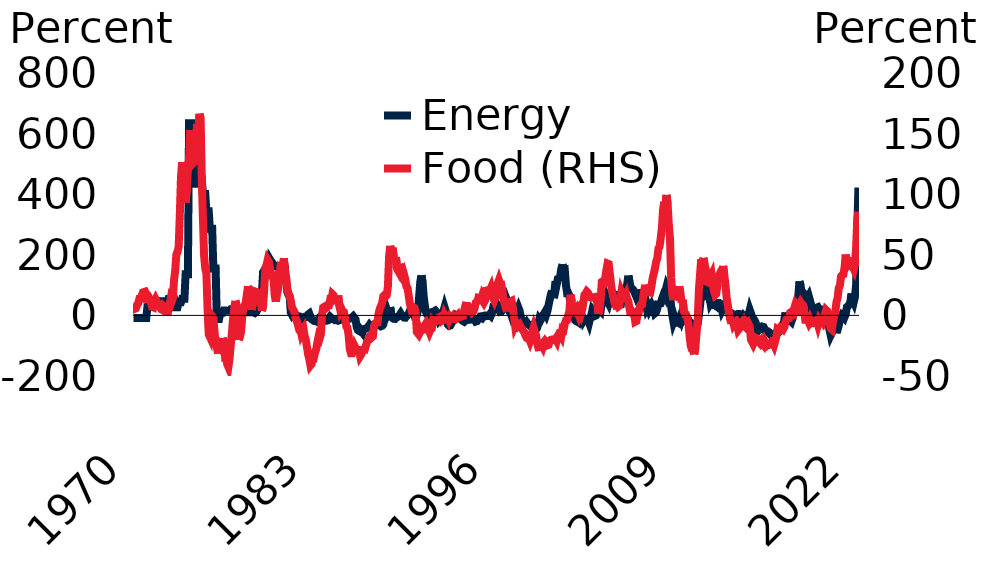
| Category | Energy |
|---|---|
| 1970-01-01 | -8.3 |
| 1970-02-01 | -8.3 |
| 1970-03-01 | -8.3 |
| 1970-04-01 | -8.3 |
| 1970-05-01 | -8.3 |
| 1970-06-01 | -8.3 |
| 1970-07-01 | -8.3 |
| 1970-08-01 | -8.3 |
| 1970-09-01 | -8.3 |
| 1970-10-01 | -8.3 |
| 1970-11-01 | -8.3 |
| 1970-12-01 | -8.3 |
| 1971-01-01 | 29.1 |
| 1971-02-01 | 29.1 |
| 1971-03-01 | 29.1 |
| 1971-04-01 | 29.1 |
| 1971-05-01 | 29.1 |
| 1971-06-01 | 29.1 |
| 1971-07-01 | 37 |
| 1971-08-01 | 37 |
| 1971-09-01 | 37 |
| 1971-10-01 | 37 |
| 1971-11-01 | 37 |
| 1971-12-01 | 37 |
| 1972-01-01 | 46.3 |
| 1972-02-01 | 46.3 |
| 1972-03-01 | 46.3 |
| 1972-04-01 | 46.3 |
| 1972-05-01 | 46.3 |
| 1972-06-01 | 46.3 |
| 1972-07-01 | 54.5 |
| 1972-08-01 | 54.5 |
| 1972-09-01 | 54.5 |
| 1972-10-01 | 54.5 |
| 1972-11-01 | 54.5 |
| 1972-12-01 | 54.5 |
| 1973-01-01 | 26.8 |
| 1973-02-01 | 26.8 |
| 1973-03-01 | 26.8 |
| 1973-04-01 | 43.3 |
| 1973-05-01 | 43.3 |
| 1973-06-01 | 43.3 |
| 1973-07-01 | 55.2 |
| 1973-08-01 | 55.2 |
| 1973-09-01 | 55.2 |
| 1973-10-01 | 135.6 |
| 1973-11-01 | 135.6 |
| 1973-12-01 | 135.6 |
| 1974-01-01 | 634.5 |
| 1974-02-01 | 634.5 |
| 1974-03-01 | 634.5 |
| 1974-04-01 | 498.9 |
| 1974-05-01 | 498.9 |
| 1974-06-01 | 498.9 |
| 1974-07-01 | 434.8 |
| 1974-08-01 | 434.8 |
| 1974-09-01 | 434.8 |
| 1974-10-01 | 450.8 |
| 1974-11-01 | 450.8 |
| 1974-12-01 | 450.8 |
| 1975-01-01 | 401 |
| 1975-02-01 | 401 |
| 1975-03-01 | 401 |
| 1975-04-01 | 343.4 |
| 1975-05-01 | 343.4 |
| 1975-06-01 | 343.4 |
| 1975-07-01 | 286.3 |
| 1975-08-01 | 286.3 |
| 1975-09-01 | 286.3 |
| 1975-10-01 | 155.1 |
| 1975-11-01 | 155.1 |
| 1975-12-01 | 155.1 |
| 1976-01-01 | -11.5 |
| 1976-02-01 | -11.5 |
| 1976-03-01 | -11.5 |
| 1976-04-01 | 8.6 |
| 1976-05-01 | 8.6 |
| 1976-06-01 | 8.6 |
| 1976-07-01 | 16 |
| 1976-08-01 | 16 |
| 1976-09-01 | 16 |
| 1976-10-01 | 15.5 |
| 1976-11-01 | 15.5 |
| 1976-12-01 | 15.5 |
| 1977-01-01 | 20 |
| 1977-02-01 | 20 |
| 1977-03-01 | 20 |
| 1977-04-01 | 19.5 |
| 1977-05-01 | 19.5 |
| 1977-06-01 | 19.5 |
| 1977-07-01 | 21.1 |
| 1977-08-01 | 21.1 |
| 1977-09-01 | 21.1 |
| 1977-10-01 | 21.2 |
| 1977-11-01 | 21.2 |
| 1977-12-01 | 21.2 |
| 1978-01-01 | 10 |
| 1978-02-01 | 10 |
| 1978-03-01 | 10 |
| 1978-04-01 | 10.2 |
| 1978-05-01 | 10.3 |
| 1978-06-01 | 10.6 |
| 1978-07-01 | 10.1 |
| 1978-08-01 | 10.3 |
| 1978-09-01 | 10.3 |
| 1978-10-01 | 8 |
| 1978-11-01 | 10.9 |
| 1978-12-01 | 17.2 |
| 1979-01-01 | 39.7 |
| 1979-02-01 | 60.6 |
| 1979-03-01 | 68.6 |
| 1979-04-01 | 71.5 |
| 1979-05-01 | 142.3 |
| 1979-06-01 | 149 |
| 1979-07-01 | 138.9 |
| 1979-08-01 | 142.8 |
| 1979-09-01 | 152 |
| 1979-10-01 | 162.6 |
| 1979-11-01 | 184.7 |
| 1979-12-01 | 178.4 |
| 1980-01-01 | 173.7 |
| 1980-02-01 | 163.7 |
| 1980-03-01 | 162.3 |
| 1980-04-01 | 161.9 |
| 1980-05-01 | 163.3 |
| 1980-06-01 | 161.7 |
| 1980-07-01 | 152.1 |
| 1980-08-01 | 137.7 |
| 1980-09-01 | 137.1 |
| 1980-10-01 | 163.8 |
| 1980-11-01 | 176 |
| 1980-12-01 | 152.7 |
| 1981-01-01 | 113.1 |
| 1981-02-01 | 77.6 |
| 1981-03-01 | 67.7 |
| 1981-04-01 | 62.8 |
| 1981-05-01 | 9.8 |
| 1981-06-01 | 2.4 |
| 1981-07-01 | 7.8 |
| 1981-08-01 | 7.4 |
| 1981-09-01 | 3.5 |
| 1981-10-01 | 0.6 |
| 1981-11-01 | -4.7 |
| 1981-12-01 | -3.2 |
| 1982-01-01 | -3.9 |
| 1982-02-01 | -6.4 |
| 1982-03-01 | -10.8 |
| 1982-04-01 | -7.2 |
| 1982-05-01 | -4.9 |
| 1982-06-01 | -5.5 |
| 1982-07-01 | -1.6 |
| 1982-08-01 | 3 |
| 1982-09-01 | 5.9 |
| 1982-10-01 | -4.2 |
| 1982-11-01 | -12.4 |
| 1982-12-01 | -15.2 |
| 1983-01-01 | -18.1 |
| 1983-02-01 | -18.2 |
| 1983-03-01 | -19.8 |
| 1983-04-01 | -15.6 |
| 1983-05-01 | -12.2 |
| 1983-06-01 | -7.1 |
| 1983-07-01 | -8.9 |
| 1983-08-01 | -9.4 |
| 1983-09-01 | -10.7 |
| 1983-10-01 | -13.4 |
| 1983-11-01 | -16.9 |
| 1983-12-01 | -17.5 |
| 1984-01-01 | -16.4 |
| 1984-02-01 | -10.3 |
| 1984-03-01 | -4.7 |
| 1984-04-01 | -8.2 |
| 1984-05-01 | -11.8 |
| 1984-06-01 | -11.9 |
| 1984-07-01 | -14.9 |
| 1984-08-01 | -13.5 |
| 1984-09-01 | -15.6 |
| 1984-10-01 | -17.5 |
| 1984-11-01 | -16.1 |
| 1984-12-01 | -14.3 |
| 1985-01-01 | -12.2 |
| 1985-02-01 | -5.7 |
| 1985-03-01 | -2.9 |
| 1985-04-01 | -6.4 |
| 1985-05-01 | -9.1 |
| 1985-06-01 | -11.3 |
| 1985-07-01 | -11.6 |
| 1985-08-01 | -10.7 |
| 1985-09-01 | -9.8 |
| 1985-10-01 | -6.3 |
| 1985-11-01 | -2.8 |
| 1985-12-01 | -7.7 |
| 1986-01-01 | -13.3 |
| 1986-02-01 | -38.3 |
| 1986-03-01 | -48.5 |
| 1986-04-01 | -50.8 |
| 1986-05-01 | -46.1 |
| 1986-06-01 | -51.3 |
| 1986-07-01 | -56.4 |
| 1986-08-01 | -45 |
| 1986-09-01 | -44.1 |
| 1986-10-01 | -43.8 |
| 1986-11-01 | -41.9 |
| 1986-12-01 | -37.1 |
| 1987-01-01 | -31.4 |
| 1987-02-01 | -35.9 |
| 1987-03-01 | -34.7 |
| 1987-04-01 | -34.9 |
| 1987-05-01 | -31.1 |
| 1987-06-01 | -29.7 |
| 1987-07-01 | -26.4 |
| 1987-08-01 | -30.2 |
| 1987-09-01 | -31.9 |
| 1987-10-01 | -32.5 |
| 1987-11-01 | -35.9 |
| 1987-12-01 | -34.5 |
| 1988-01-01 | -30.3 |
| 1988-02-01 | -6.2 |
| 1988-03-01 | 5.4 |
| 1988-04-01 | 18.9 |
| 1988-05-01 | 7.1 |
| 1988-06-01 | 15.2 |
| 1988-07-01 | 27.2 |
| 1988-08-01 | 1.2 |
| 1988-09-01 | -8.6 |
| 1988-10-01 | -11.4 |
| 1988-11-01 | -11.5 |
| 1988-12-01 | -5.5 |
| 1989-01-01 | -6.1 |
| 1989-02-01 | -3.5 |
| 1989-03-01 | 0.6 |
| 1989-04-01 | 6.4 |
| 1989-05-01 | -0.1 |
| 1989-06-01 | -2.9 |
| 1989-07-01 | -7.1 |
| 1989-08-01 | -7.5 |
| 1989-09-01 | -1.8 |
| 1989-10-01 | 0.5 |
| 1989-11-01 | 4.8 |
| 1989-12-01 | 16 |
| 1990-01-01 | 23 |
| 1990-02-01 | 21 |
| 1990-03-01 | 18.9 |
| 1990-04-01 | 2 |
| 1990-05-01 | 4.2 |
| 1990-06-01 | 1.5 |
| 1990-07-01 | 15.2 |
| 1990-08-01 | 61.5 |
| 1990-09-01 | 110.7 |
| 1990-10-01 | 131.9 |
| 1990-11-01 | 109.3 |
| 1990-12-01 | 60.5 |
| 1991-01-01 | 31.4 |
| 1991-02-01 | 10.1 |
| 1991-03-01 | 2.5 |
| 1991-04-01 | -0.8 |
| 1991-05-01 | 4.8 |
| 1991-06-01 | 1.7 |
| 1991-07-01 | 6.1 |
| 1991-08-01 | 12.4 |
| 1991-09-01 | 13.6 |
| 1991-10-01 | 15.8 |
| 1991-11-01 | 11.4 |
| 1991-12-01 | -6.3 |
| 1992-01-01 | -16.5 |
| 1992-02-01 | -11.6 |
| 1992-03-01 | -4.9 |
| 1992-04-01 | 9 |
| 1992-05-01 | 13.1 |
| 1992-06-01 | 26.8 |
| 1992-07-01 | 14.5 |
| 1992-08-01 | -19.7 |
| 1992-09-01 | -30.7 |
| 1992-10-01 | -34.4 |
| 1992-11-01 | -33.4 |
| 1992-12-01 | -26.4 |
| 1993-01-01 | -20.1 |
| 1993-02-01 | -1.4 |
| 1993-03-01 | 3.2 |
| 1993-04-01 | 1.8 |
| 1993-05-01 | -1.4 |
| 1993-06-01 | -1 |
| 1993-07-01 | -9.3 |
| 1993-08-01 | -9.4 |
| 1993-09-01 | -15.5 |
| 1993-10-01 | -18.9 |
| 1993-11-01 | -20.8 |
| 1993-12-01 | -16.8 |
| 1994-01-01 | -10.9 |
| 1994-02-01 | -11.1 |
| 1994-03-01 | -14.7 |
| 1994-04-01 | -14.3 |
| 1994-05-01 | -13.2 |
| 1994-06-01 | -13.9 |
| 1994-07-01 | -9.4 |
| 1994-08-01 | -13.3 |
| 1994-09-01 | -20.3 |
| 1994-10-01 | -19 |
| 1994-11-01 | -11.1 |
| 1994-12-01 | -10.8 |
| 1995-01-01 | -3.3 |
| 1995-02-01 | -2.8 |
| 1995-03-01 | -6.8 |
| 1995-04-01 | -1.7 |
| 1995-05-01 | -0.2 |
| 1995-06-01 | -0.3 |
| 1995-07-01 | -2.2 |
| 1995-08-01 | -1.7 |
| 1995-09-01 | 3.1 |
| 1995-10-01 | -0.9 |
| 1995-11-01 | 8.3 |
| 1995-12-01 | 25.6 |
| 1996-01-01 | 24.9 |
| 1996-02-01 | 33.1 |
| 1996-03-01 | 38.4 |
| 1996-04-01 | 32.8 |
| 1996-05-01 | 17.4 |
| 1996-06-01 | 11.3 |
| 1996-07-01 | 12 |
| 1996-08-01 | 19.7 |
| 1996-09-01 | 32.9 |
| 1996-10-01 | 40.6 |
| 1996-11-01 | 33.9 |
| 1996-12-01 | 49.6 |
| 1997-01-01 | 39.3 |
| 1997-02-01 | 17 |
| 1997-03-01 | 10.6 |
| 1997-04-01 | -1.1 |
| 1997-05-01 | 6.7 |
| 1997-06-01 | 4.6 |
| 1997-07-01 | 13.5 |
| 1997-08-01 | 14.4 |
| 1997-09-01 | 14.1 |
| 1997-10-01 | 24.3 |
| 1997-11-01 | 14.4 |
| 1997-12-01 | -6.6 |
| 1998-01-01 | -17.1 |
| 1998-02-01 | -25 |
| 1998-03-01 | -28.6 |
| 1998-04-01 | -28.2 |
| 1998-05-01 | -22.7 |
| 1998-06-01 | -28.1 |
| 1998-07-01 | -30.4 |
| 1998-08-01 | -34.2 |
| 1998-09-01 | -32.5 |
| 1998-10-01 | -39.7 |
| 1998-11-01 | -42.7 |
| 1998-12-01 | -52.8 |
| 1999-01-01 | -47.5 |
| 1999-02-01 | -42.2 |
| 1999-03-01 | -28.9 |
| 1999-04-01 | -11.9 |
| 1999-05-01 | -16.6 |
| 1999-06-01 | -9.5 |
| 1999-07-01 | 0.1 |
| 1999-08-01 | 4.7 |
| 1999-09-01 | 11.5 |
| 1999-10-01 | 3.5 |
| 1999-11-01 | 14.8 |
| 1999-12-01 | 34.1 |
| 2000-01-01 | 52.8 |
| 2000-02-01 | 69.4 |
| 2000-03-01 | 81.4 |
| 2000-04-01 | 57.6 |
| 2000-05-01 | 79 |
| 2000-06-01 | 113 |
| 2000-07-01 | 101.9 |
| 2000-08-01 | 120.8 |
| 2000-09-01 | 122.5 |
| 2000-10-01 | 128.6 |
| 2000-11-01 | 154.3 |
| 2000-12-01 | 168.4 |
| 2001-01-01 | 149.1 |
| 2001-02-01 | 150.1 |
| 2001-03-01 | 100.2 |
| 2001-04-01 | 73.6 |
| 2001-05-01 | 73.7 |
| 2001-06-01 | 64.8 |
| 2001-07-01 | 33.5 |
| 2001-08-01 | 26.9 |
| 2001-09-01 | 11.2 |
| 2001-10-01 | -2.4 |
| 2001-11-01 | -16.2 |
| 2001-12-01 | -19.7 |
| 2002-01-01 | -20.5 |
| 2002-02-01 | -23.1 |
| 2002-03-01 | -11 |
| 2002-04-01 | 6.8 |
| 2002-05-01 | -5.6 |
| 2002-06-01 | -18 |
| 2002-07-01 | -11.6 |
| 2002-08-01 | -12.5 |
| 2002-09-01 | -15.1 |
| 2002-10-01 | -13.7 |
| 2002-11-01 | -24.1 |
| 2002-12-01 | -8.2 |
| 2003-01-01 | 1.5 |
| 2003-02-01 | 19.8 |
| 2003-03-01 | 15.7 |
| 2003-04-01 | -1.9 |
| 2003-05-01 | -0.3 |
| 2003-06-01 | 8.2 |
| 2003-07-01 | 18.1 |
| 2003-08-01 | 18.3 |
| 2003-09-01 | 14.4 |
| 2003-10-01 | 40.2 |
| 2003-11-01 | 53.7 |
| 2003-12-01 | 67.5 |
| 2004-01-01 | 71.6 |
| 2004-02-01 | 62.7 |
| 2004-03-01 | 47.4 |
| 2004-04-01 | 39.6 |
| 2004-05-01 | 52.7 |
| 2004-06-01 | 54.2 |
| 2004-07-01 | 56.3 |
| 2004-08-01 | 61.5 |
| 2004-09-01 | 49 |
| 2004-10-01 | 68.6 |
| 2004-11-01 | 68.3 |
| 2004-12-01 | 42.2 |
| 2005-01-01 | 37.8 |
| 2005-02-01 | 26.2 |
| 2005-03-01 | 58.6 |
| 2005-04-01 | 83.6 |
| 2005-05-01 | 67.8 |
| 2005-06-01 | 77.9 |
| 2005-07-01 | 87.7 |
| 2005-08-01 | 103.1 |
| 2005-09-01 | 131.1 |
| 2005-10-01 | 111.5 |
| 2005-11-01 | 92.6 |
| 2005-12-01 | 89 |
| 2006-01-01 | 85.7 |
| 2006-02-01 | 79.4 |
| 2006-03-01 | 70.1 |
| 2006-04-01 | 84.3 |
| 2006-05-01 | 66 |
| 2006-06-01 | 71.8 |
| 2006-07-01 | 73.2 |
| 2006-08-01 | 62.5 |
| 2006-09-01 | 41.8 |
| 2006-10-01 | 20.1 |
| 2006-11-01 | 35.6 |
| 2006-12-01 | 45.7 |
| 2007-01-01 | 22.6 |
| 2007-02-01 | 29 |
| 2007-03-01 | 17.8 |
| 2007-04-01 | 25.1 |
| 2007-05-01 | 32.7 |
| 2007-06-01 | 23.5 |
| 2007-07-01 | 24 |
| 2007-08-01 | 7.4 |
| 2007-09-01 | 10.7 |
| 2007-10-01 | 22.4 |
| 2007-11-01 | 48.2 |
| 2007-12-01 | 38.1 |
| 2008-01-01 | 39.3 |
| 2008-02-01 | 53.6 |
| 2008-03-01 | 64.2 |
| 2008-04-01 | 59.7 |
| 2008-05-01 | 79.4 |
| 2008-06-01 | 94.8 |
| 2008-07-01 | 86.3 |
| 2008-08-01 | 59.9 |
| 2008-09-01 | 65.3 |
| 2008-10-01 | 31.1 |
| 2008-11-01 | 1 |
| 2008-12-01 | -20.7 |
| 2009-01-01 | -10.4 |
| 2009-02-01 | -23.6 |
| 2009-03-01 | -21.3 |
| 2009-04-01 | -23.6 |
| 2009-05-01 | -13.8 |
| 2009-06-01 | -3.5 |
| 2009-07-01 | -14.4 |
| 2009-08-01 | -3.2 |
| 2009-09-01 | -14.1 |
| 2009-10-01 | -12.3 |
| 2009-11-01 | -17.5 |
| 2009-12-01 | -16.6 |
| 2010-01-01 | -15.3 |
| 2010-02-01 | -21.8 |
| 2010-03-01 | -24.8 |
| 2010-04-01 | -26.5 |
| 2010-05-01 | -40 |
| 2010-06-01 | -44.5 |
| 2010-07-01 | -45 |
| 2010-08-01 | -35.6 |
| 2010-09-01 | -27.5 |
| 2010-10-01 | 0.6 |
| 2010-11-01 | 31.9 |
| 2010-12-01 | 74.8 |
| 2011-01-01 | 78.5 |
| 2011-02-01 | 100.8 |
| 2011-03-01 | 107.2 |
| 2011-04-01 | 114 |
| 2011-05-01 | 77.7 |
| 2011-06-01 | 50.9 |
| 2011-07-01 | 65 |
| 2011-08-01 | 41.8 |
| 2011-09-01 | 48.6 |
| 2011-10-01 | 34.3 |
| 2011-11-01 | 34.5 |
| 2011-12-01 | 33.5 |
| 2012-01-01 | 30.7 |
| 2012-02-01 | 40.9 |
| 2012-03-01 | 40.9 |
| 2012-04-01 | 30 |
| 2012-05-01 | 32.1 |
| 2012-06-01 | 16.7 |
| 2012-07-01 | 24.4 |
| 2012-08-01 | 32.8 |
| 2012-09-01 | 33.8 |
| 2012-10-01 | 23.9 |
| 2012-11-01 | 17.5 |
| 2012-12-01 | 10.2 |
| 2013-01-01 | 9.7 |
| 2013-02-01 | 7.7 |
| 2013-03-01 | -5.2 |
| 2013-04-01 | -13.3 |
| 2013-05-01 | -7.5 |
| 2013-06-01 | -6.3 |
| 2013-07-01 | -4.2 |
| 2013-08-01 | 4.6 |
| 2013-09-01 | 4.9 |
| 2013-10-01 | 3.3 |
| 2013-11-01 | -3.1 |
| 2013-12-01 | 1.1 |
| 2014-01-01 | -3.3 |
| 2014-02-01 | -4.2 |
| 2014-03-01 | -9.4 |
| 2014-04-01 | -5.7 |
| 2014-05-01 | 2.1 |
| 2014-06-01 | 17.9 |
| 2014-07-01 | 7.1 |
| 2014-08-01 | -5.1 |
| 2014-09-01 | -9.3 |
| 2014-10-01 | -15.6 |
| 2014-11-01 | -22.3 |
| 2014-12-01 | -36.7 |
| 2015-01-01 | -50.9 |
| 2015-02-01 | -46 |
| 2015-03-01 | -45.8 |
| 2015-04-01 | -41.6 |
| 2015-05-01 | -37 |
| 2015-06-01 | -38.1 |
| 2015-07-01 | -46.3 |
| 2015-08-01 | -54.7 |
| 2015-09-01 | -54.7 |
| 2015-10-01 | -53.5 |
| 2015-11-01 | -56.3 |
| 2015-12-01 | -63.4 |
| 2016-01-01 | -68.3 |
| 2016-02-01 | -68.8 |
| 2016-03-01 | -63.1 |
| 2016-04-01 | -60.3 |
| 2016-05-01 | -56 |
| 2016-06-01 | -54.5 |
| 2016-07-01 | -55.4 |
| 2016-08-01 | -52.6 |
| 2016-09-01 | -50.1 |
| 2016-10-01 | -39.4 |
| 2016-11-01 | -37.7 |
| 2016-12-01 | -12.8 |
| 2017-01-01 | 9.8 |
| 2017-02-01 | -2.2 |
| 2017-03-01 | -4.7 |
| 2017-04-01 | -6.8 |
| 2017-05-01 | -17.2 |
| 2017-06-01 | -20.9 |
| 2017-07-01 | -9.6 |
| 2017-08-01 | 10.2 |
| 2017-09-01 | 15.3 |
| 2017-10-01 | 18.8 |
| 2017-11-01 | 39.8 |
| 2017-12-01 | 64.9 |
| 2018-01-01 | 112.5 |
| 2018-02-01 | 97.5 |
| 2018-03-01 | 71.4 |
| 2018-04-01 | 68.5 |
| 2018-05-01 | 61.7 |
| 2018-06-01 | 52 |
| 2018-07-01 | 62 |
| 2018-08-01 | 57.4 |
| 2018-09-01 | 64.2 |
| 2018-10-01 | 50.6 |
| 2018-11-01 | 36.4 |
| 2018-12-01 | 6.1 |
| 2019-01-01 | 6.5 |
| 2019-02-01 | 11.6 |
| 2019-03-01 | 22.6 |
| 2019-04-01 | 25.7 |
| 2019-05-01 | 27.3 |
| 2019-06-01 | 21.3 |
| 2019-07-01 | 20.4 |
| 2019-08-01 | 7.8 |
| 2019-09-01 | 7 |
| 2019-10-01 | 0.1 |
| 2019-11-01 | -2.6 |
| 2019-12-01 | -1.5 |
| 2020-01-01 | -12.4 |
| 2020-02-01 | -19.3 |
| 2020-03-01 | -48 |
| 2020-04-01 | -65.8 |
| 2020-05-01 | -57.7 |
| 2020-06-01 | -46.8 |
| 2020-07-01 | -44.2 |
| 2020-08-01 | -40.5 |
| 2020-09-01 | -46.7 |
| 2020-10-01 | -47 |
| 2020-11-01 | -33.3 |
| 2020-12-01 | -13.4 |
| 2021-01-01 | -6.1 |
| 2021-02-01 | 2.4 |
| 2021-03-01 | -0.1 |
| 2021-04-01 | -5.7 |
| 2021-05-01 | 4 |
| 2021-06-01 | 27.5 |
| 2021-07-01 | 30.5 |
| 2021-08-01 | 35.9 |
| 2021-09-01 | 43.8 |
| 2021-10-01 | 72.5 |
| 2021-11-01 | 53.8 |
| 2021-12-01 | 44.8 |
| 2022-01-01 | 61.5 |
| 2022-02-01 | 99.6 |
| 2022-03-01 | 282.4 |
| 2022-04-01 | 422 |